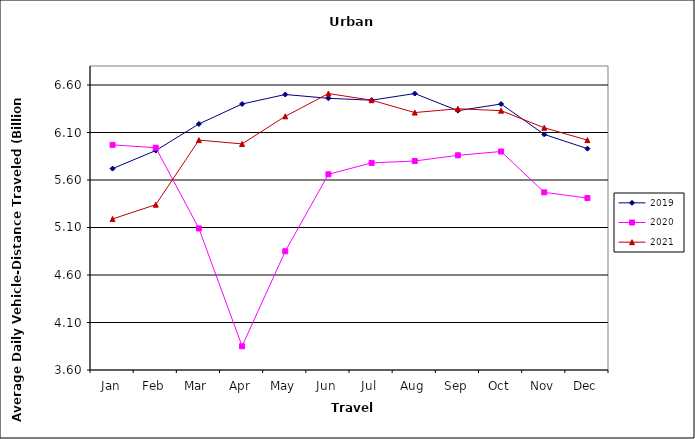
| Category | 2019 | 2020 | 2021 |
|---|---|---|---|
| Jan | 5.72 | 5.97 | 5.19 |
| Feb | 5.91 | 5.94 | 5.34 |
| Mar | 6.19 | 5.09 | 6.02 |
| Apr | 6.4 | 3.85 | 5.98 |
| May | 6.5 | 4.85 | 6.27 |
| Jun | 6.46 | 5.66 | 6.51 |
| Jul | 6.44 | 5.78 | 6.44 |
| Aug | 6.51 | 5.8 | 6.31 |
| Sep | 6.33 | 5.86 | 6.35 |
| Oct | 6.4 | 5.9 | 6.33 |
| Nov | 6.08 | 5.47 | 6.15 |
| Dec | 5.93 | 5.41 | 6.02 |